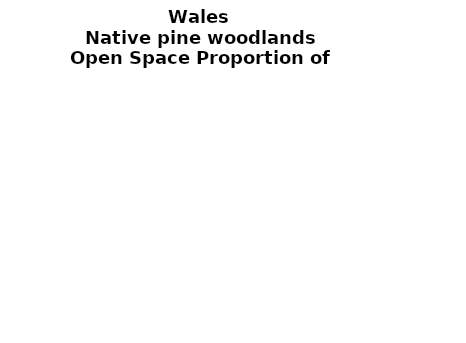
| Category | Native pine woodlands |
|---|---|
|  ≥ 10ha, < 10%  | 0 |
|   ≥ 10ha, 10-25% | 0 |
|   ≥ 10ha, > 25 and <50%  | 0 |
|   ≥ 10ha, ≥ 50%  | 0 |
|  < 10ha, < 10% | 0 |
|  < 10ha, 10-25% | 0 |
|  < 10ha, > 25 and < 50% | 0 |
|  < 10ha, ≥ 50% | 0 |